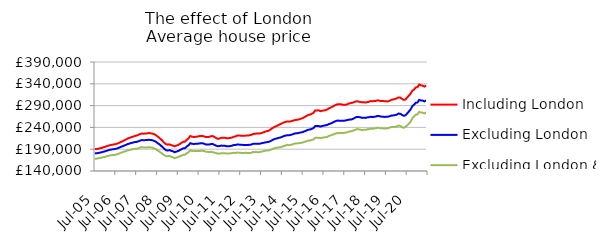
| Category | Including London | Excluding London | Excluding London & SE |
|---|---|---|---|
| 2005-07-01 | 190099.846 | 180338.943 | 168115.943 |
| 2005-08-01 | 190409.416 | 180707.116 | 168387.745 |
| 2005-09-01 | 191025.705 | 181294.079 | 169165.237 |
| 2005-10-01 | 192128.229 | 182260.003 | 170136.846 |
| 2005-11-01 | 193022.749 | 183020.557 | 170802.395 |
| 2005-12-01 | 194589.472 | 184321.051 | 171890.78 |
| 2006-01-01 | 195561.889 | 185223.855 | 172601.05 |
| 2006-02-01 | 197180.233 | 186694.526 | 173973.307 |
| 2006-03-01 | 198290.018 | 187883.534 | 175074.67 |
| 2006-04-01 | 199521.21 | 188954.872 | 175987.174 |
| 2006-05-01 | 200291.878 | 189620.06 | 176437.969 |
| 2006-06-01 | 200874.24 | 190048.53 | 176847.591 |
| 2006-07-01 | 201753.772 | 190830.896 | 177451.803 |
| 2006-08-01 | 202945.476 | 191932.237 | 178625.067 |
| 2006-09-01 | 204665.909 | 193486.107 | 180029.257 |
| 2006-10-01 | 206669.853 | 195431.198 | 181917.714 |
| 2006-11-01 | 208271.992 | 196704.296 | 182996.889 |
| 2006-12-01 | 210431.706 | 198484.218 | 184628.33 |
| 2007-01-01 | 212236.573 | 199867.99 | 185753.039 |
| 2007-02-01 | 214691.924 | 201953.448 | 187491.53 |
| 2007-03-01 | 215960.598 | 202950.014 | 188129.855 |
| 2007-04-01 | 217668.208 | 204390.327 | 189305.612 |
| 2007-05-01 | 218745.526 | 205176.529 | 190051.523 |
| 2007-06-01 | 220436.757 | 206350.676 | 190766.928 |
| 2007-07-01 | 221128.98 | 206601.586 | 190934.336 |
| 2007-08-01 | 222903.284 | 208023.687 | 191970.933 |
| 2007-09-01 | 224639.27 | 209648.69 | 193488.751 |
| 2007-10-01 | 225909.983 | 210886.574 | 194554.085 |
| 2007-11-01 | 225637.65 | 210701.658 | 194139.319 |
| 2007-12-01 | 225795.991 | 210808.016 | 194100.151 |
| 2008-01-01 | 226230.744 | 210997.948 | 193849.067 |
| 2008-02-01 | 227150.677 | 211685.752 | 194629.825 |
| 2008-03-01 | 226536.237 | 211131.036 | 194027.854 |
| 2008-04-01 | 226088.749 | 210687.499 | 193735.581 |
| 2008-05-01 | 224583.894 | 209243.33 | 192031.653 |
| 2008-06-01 | 222870.934 | 207605.676 | 190599.84 |
| 2008-07-01 | 219624.904 | 204552.197 | 187738.181 |
| 2008-08-01 | 216697.269 | 201783.679 | 185273.991 |
| 2008-09-01 | 213087.292 | 198550.708 | 182220.184 |
| 2008-10-01 | 209193.305 | 194954.131 | 179292.765 |
| 2008-11-01 | 204692.274 | 190946.059 | 176189.96 |
| 2008-12-01 | 201599.231 | 187849.92 | 174117.242 |
| 2009-01-01 | 200403.32 | 186878.072 | 173689.928 |
| 2009-02-01 | 201116.809 | 187902.199 | 174505.275 |
| 2009-03-01 | 199383.582 | 186328.236 | 172948.571 |
| 2009-04-01 | 198315.606 | 185259.882 | 171374.665 |
| 2009-05-01 | 196756.715 | 183093.397 | 169466.686 |
| 2009-06-01 | 198255.489 | 184493.743 | 170575.472 |
| 2009-07-01 | 199781.16 | 185725.435 | 171866.354 |
| 2009-08-01 | 202057.625 | 187894.019 | 173683.287 |
| 2009-09-01 | 204651.712 | 189897.228 | 175272.485 |
| 2009-10-01 | 206995.738 | 192147.604 | 177124.978 |
| 2009-11-01 | 207417.779 | 192401.732 | 177434.262 |
| 2009-12-01 | 211553.202 | 196348.095 | 180850.865 |
| 2010-01-01 | 214966.047 | 198975.275 | 183057.657 |
| 2010-02-01 | 220222.605 | 203842.442 | 187600.547 |
| 2010-03-01 | 218833.653 | 202417 | 186103.773 |
| 2010-04-01 | 218095.869 | 201947.595 | 185606.518 |
| 2010-05-01 | 218270.945 | 202369.228 | 185653.56 |
| 2010-06-01 | 219021.418 | 202622.997 | 185715.112 |
| 2010-07-01 | 219694.86 | 202909.807 | 185694.318 |
| 2010-08-01 | 220453.705 | 203427.774 | 186228.655 |
| 2010-09-01 | 220333.072 | 203554.602 | 186584.363 |
| 2010-10-01 | 219430.502 | 202646.38 | 185826.104 |
| 2010-11-01 | 217758.718 | 200820.946 | 184169.331 |
| 2010-12-01 | 217843.886 | 200598.076 | 183920.647 |
| 2011-01-01 | 218308.872 | 200845.74 | 183620.819 |
| 2011-02-01 | 219903.599 | 201942.266 | 184034.672 |
| 2011-03-01 | 220093.176 | 201787.31 | 183239.142 |
| 2011-04-01 | 217992.594 | 199967.499 | 182219.013 |
| 2011-05-01 | 215269.271 | 198004.825 | 180728.026 |
| 2011-06-01 | 213677.232 | 196824.513 | 179824.569 |
| 2011-07-01 | 214756.836 | 197366.561 | 180053.186 |
| 2011-08-01 | 216261.648 | 198273.54 | 180722.379 |
| 2011-09-01 | 216160.859 | 198017.112 | 180733.396 |
| 2011-10-01 | 216413 | 198044.687 | 180992.117 |
| 2011-11-01 | 215076.714 | 196723.016 | 179930.308 |
| 2011-12-01 | 215195.615 | 196619.922 | 180098.389 |
| 2012-01-01 | 215831.279 | 197197.229 | 180433.467 |
| 2012-02-01 | 216608.392 | 198028.239 | 181160.203 |
| 2012-03-01 | 218433.925 | 199448.115 | 181654.074 |
| 2012-04-01 | 219229.758 | 199570.129 | 181401.405 |
| 2012-05-01 | 221315.79 | 200758.529 | 182172.379 |
| 2012-06-01 | 221273.57 | 200554.841 | 182125.023 |
| 2012-07-01 | 221114.337 | 200270.358 | 181588.763 |
| 2012-08-01 | 220621.314 | 199950.2 | 181454.035 |
| 2012-09-01 | 220819.802 | 199578.294 | 181206.962 |
| 2012-10-01 | 221141.866 | 199928.213 | 181838.461 |
| 2012-11-01 | 221164.226 | 199365.164 | 181019.915 |
| 2012-12-01 | 221860.869 | 200187.818 | 181487.387 |
| 2013-01-01 | 222596.882 | 200321.308 | 181562.915 |
| 2013-02-01 | 224450.937 | 202165.818 | 183480.908 |
| 2013-03-01 | 225296.589 | 202321.905 | 183206.742 |
| 2013-04-01 | 225849.652 | 202728.281 | 183560.204 |
| 2013-05-01 | 225718.614 | 202362.124 | 182827.175 |
| 2013-06-01 | 226002.925 | 202691.089 | 183604.49 |
| 2013-07-01 | 226930.605 | 203452.386 | 184205.442 |
| 2013-08-01 | 228408.536 | 204423.05 | 185436.988 |
| 2013-09-01 | 229824.697 | 205278.944 | 186429.386 |
| 2013-10-01 | 231209.99 | 206154.794 | 187034.581 |
| 2013-11-01 | 232088.932 | 206444.18 | 187070.066 |
| 2013-12-01 | 234238.428 | 208094.651 | 188041.365 |
| 2014-01-01 | 237365.145 | 210155.879 | 189823.412 |
| 2014-02-01 | 239694.72 | 212174.554 | 191400.886 |
| 2014-03-01 | 242055.681 | 214012.688 | 192900.354 |
| 2014-04-01 | 243338.29 | 214775.303 | 193389.924 |
| 2014-05-01 | 245816.756 | 216038.374 | 194254.493 |
| 2014-06-01 | 247723.782 | 216873.628 | 194603.277 |
| 2014-07-01 | 249499.817 | 218444.174 | 195701.02 |
| 2014-08-01 | 251313.134 | 220200.2 | 197405.702 |
| 2014-09-01 | 252749.811 | 221247.959 | 198503.997 |
| 2014-10-01 | 253554.587 | 222116.231 | 199576.85 |
| 2014-11-01 | 253513.511 | 222004.979 | 199176.596 |
| 2014-12-01 | 253886.163 | 222912.5 | 200103.642 |
| 2015-01-01 | 255260.291 | 224151.478 | 201048.861 |
| 2015-02-01 | 256442.252 | 225640.668 | 202626.686 |
| 2015-03-01 | 257148.908 | 226552.252 | 203261.427 |
| 2015-04-01 | 257702.233 | 226857.13 | 203464.345 |
| 2015-05-01 | 258891.89 | 227735.502 | 204003.881 |
| 2015-06-01 | 260266.761 | 228497.388 | 204654.697 |
| 2015-07-01 | 261578.962 | 229583.14 | 205554.043 |
| 2015-08-01 | 264001.261 | 231254.691 | 207167.691 |
| 2015-09-01 | 265964.492 | 232711.522 | 208140.346 |
| 2015-10-01 | 268628.509 | 234826.4 | 209815.018 |
| 2015-11-01 | 269111.396 | 234960.65 | 209639.335 |
| 2015-12-01 | 271150.763 | 236640.113 | 211071.853 |
| 2016-01-01 | 273132.57 | 238155.033 | 212260.808 |
| 2016-02-01 | 278749.158 | 242942.359 | 215948.01 |
| 2016-03-01 | 279015.252 | 243059.927 | 216042.757 |
| 2016-04-01 | 279083.931 | 243156.96 | 216229.924 |
| 2016-05-01 | 277191.159 | 241777.856 | 215266.08 |
| 2016-06-01 | 278300.659 | 243277.523 | 216464.604 |
| 2016-07-01 | 278735.279 | 244000.624 | 216833.27 |
| 2016-08-01 | 279550.537 | 244824.223 | 217449.986 |
| 2016-09-01 | 281143.525 | 245745.556 | 218307.062 |
| 2016-10-01 | 283844.145 | 247892.088 | 220607.247 |
| 2016-11-01 | 285456.064 | 248896.599 | 221544.872 |
| 2016-12-01 | 287658.857 | 250984.14 | 223268.01 |
| 2017-01-01 | 289822.876 | 252856.968 | 224563.197 |
| 2017-02-01 | 291690.019 | 254624.594 | 226037.212 |
| 2017-03-01 | 293217.574 | 255694.681 | 227103.647 |
| 2017-04-01 | 293135.305 | 255292.47 | 226801.402 |
| 2017-05-01 | 293034.824 | 255419.745 | 227111.743 |
| 2017-06-01 | 291896.223 | 255008.621 | 226919.533 |
| 2017-07-01 | 291758.358 | 255528.067 | 227535.038 |
| 2017-08-01 | 292226.381 | 256292.983 | 228386.334 |
| 2017-09-01 | 294023.961 | 257274.595 | 229630.433 |
| 2017-10-01 | 295304.478 | 258022.621 | 230765.593 |
| 2017-11-01 | 296276.989 | 258364.335 | 231354.162 |
| 2017-12-01 | 297197.81 | 259939.638 | 232603.923 |
| 2018-01-01 | 298811.713 | 262071.424 | 234229.967 |
| 2018-02-01 | 300029.625 | 264099.346 | 235949.705 |
| 2018-03-01 | 299205.749 | 263836.12 | 235633.643 |
| 2018-04-01 | 298409.542 | 263175.091 | 234927.027 |
| 2018-05-01 | 297506.941 | 261851.64 | 233870.644 |
| 2018-06-01 | 297959.121 | 262280.237 | 234472.165 |
| 2018-07-01 | 297018.79 | 261760.695 | 234340.531 |
| 2018-08-01 | 297858.66 | 262927.093 | 235563.171 |
| 2018-09-01 | 298624.478 | 263218.429 | 235954.032 |
| 2018-10-01 | 300545.418 | 264469.385 | 237346.704 |
| 2018-11-01 | 299652.448 | 263523.362 | 236597.887 |
| 2018-12-01 | 300349.168 | 264311.745 | 237550.778 |
| 2019-01-01 | 300797.826 | 264937.704 | 237849.686 |
| 2019-02-01 | 302149.078 | 266418.975 | 239203.748 |
| 2019-03-01 | 301209.863 | 265776.004 | 238643.338 |
| 2019-04-01 | 300448.054 | 264869.293 | 238200.831 |
| 2019-05-01 | 300433.595 | 264305.857 | 237799.923 |
| 2019-06-01 | 300235.304 | 264098.537 | 237343.419 |
| 2019-07-01 | 299725.745 | 264203.148 | 237521.622 |
| 2019-08-01 | 299567.415 | 264552.195 | 238040.975 |
| 2019-09-01 | 301214.163 | 265749.854 | 239621.052 |
| 2019-10-01 | 303183.912 | 267081.618 | 240884.038 |
| 2019-11-01 | 304171.981 | 267442.68 | 240925.05 |
| 2019-12-01 | 305066.407 | 268137.19 | 241386.903 |
| 2020-01-01 | 306384.445 | 269050.565 | 241963.001 |
| 2020-02-01 | 308805.402 | 271660.115 | 244377.561 |
| 2020-03-01 | 308732.035 | 271497.84 | 243338.162 |
| 2020-04-01 | 305746.977 | 269024.06 | 240884.325 |
| 2020-05-01 | 303172.203 | 266573.028 | 239035.014 |
| 2020-06-01 | 303816.431 | 267524.525 | 240914.614 |
| 2020-07-01 | 307974.87 | 271601.616 | 244630.797 |
| 2020-08-01 | 312828.724 | 276301.621 | 248367.856 |
| 2020-09-01 | 317088.553 | 280930.533 | 252681.951 |
| 2020-10-01 | 324161.334 | 288559.747 | 261016.761 |
| 2020-11-01 | 326663.271 | 291935.347 | 264732.259 |
| 2020-12-01 | 331420.181 | 296446.557 | 269262.835 |
| 2021-01-01 | 332444.678 | 297169.676 | 269818.866 |
| 2021-02-01 | 338410.469 | 303028.186 | 275501.91 |
| 2021-03-01 | 336330.442 | 301782.903 | 274166.192 |
| 2021-04-01 | 335795.945 | 301642.47 | 273753.207 |
| 2021-05-01 | 333522.583 | 299516.543 | 271880.885 |
| 2021-06-01 | 336247.078 | 301943.331 | 274441.041 |